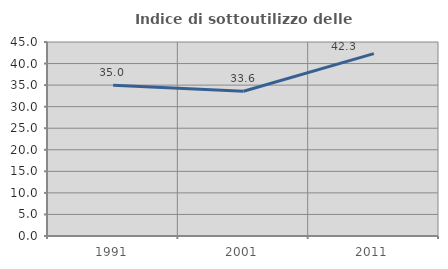
| Category | Indice di sottoutilizzo delle abitazioni  |
|---|---|
| 1991.0 | 34.969 |
| 2001.0 | 33.582 |
| 2011.0 | 42.291 |